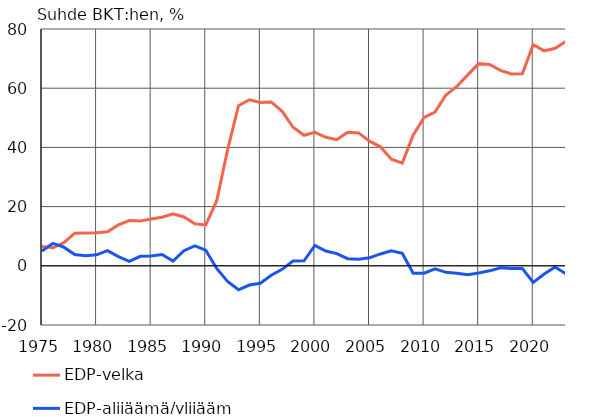
| Category | EDP-velka | EDP-alijäämä/ylijäämä |
|---|---|---|
| 1975 | 6.5 | 5 |
| 1976 | 6.1 | 7.6 |
| 1977 | 7.8 | 6.3 |
| 1978 | 11 | 3.8 |
| 1979 | 11.1 | 3.4 |
| 1980 | 11.2 | 3.7 |
| 1981 | 11.5 | 5.1 |
| 1982 | 13.8 | 3.1 |
| 1983 | 15.3 | 1.5 |
| 1984 | 15.1 | 3.2 |
| 1985 | 15.8 | 3.3 |
| 1986 | 16.4 | 3.8 |
| 1987 | 17.6 | 1.6 |
| 1988 | 16.5 | 5.1 |
| 1989 | 14.2 | 6.7 |
| 1990 | 13.8 | 5.3 |
| 1991 | 21.9 | -0.9 |
| 1992 | 39.2 | -5.3 |
| 1993 | 54.1 | -8.1 |
| 1994 | 56.1 | -6.5 |
| 1995 | 55.2 | -5.9 |
| 1996 | 55.3 | -3.2 |
| 1997 | 52.2 | -1.2 |
| 1998 | 46.8 | 1.6 |
| 1999 | 44.1 | 1.7 |
| 2000 | 45.1 | 6.9 |
| 2001 | 43.4 | 5 |
| 2002 | 42.6 | 4.1 |
| 2003 | 45.1 | 2.4 |
| 2004 | 44.9 | 2.2 |
| 2005 | 42.1 | 2.7 |
| 2006 | 40.2 | 4 |
| 2007 | 36 | 5.1 |
| 2008 | 34.7 | 4.2 |
| 2009 | 44.1 | -2.5 |
| 2010 | 50.1 | -2.5 |
| 2011 | 51.9 | -1 |
| 2012 | 57.7 | -2.2 |
| 2013 | 60.6 | -2.5 |
| 2014 | 64.5 | -3 |
| 2015 | 68.3 | -2.4 |
| 2016 | 68 | -1.7 |
| 2017 | 66 | -0.7 |
| 2018 | 64.8 | -0.9 |
| 2019 | 64.9 | -0.9 |
| 2020 | 74.7 | -5.6 |
| 2021 | 72.6 | -2.8 |
| 2022* | 73.5 | -0.4 |
| 2023* | 75.8 | -2.7 |